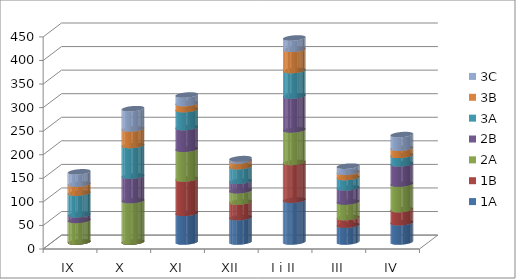
| Category | 1A | 1B | 2A | 2B | 3A | 3B | 3C |
|---|---|---|---|---|---|---|---|
| IX | 0 | 0 | 46 | 12 | 46 | 19 | 26 |
| X  | 0 | 0 | 88 | 52 | 65 | 35 | 43 |
| XI | 61 | 73 | 63 | 46 | 38 | 13 | 18 |
| XII | 52 | 33 | 24 | 20 | 31 | 12 | 5 |
| I i II | 89 | 80 | 69 | 72 | 54 | 45 | 24 |
| III | 36 | 16 | 33 | 30 | 22 | 11 | 13 |
| IV | 41 | 28 | 54 | 43 | 18 | 15 | 29 |